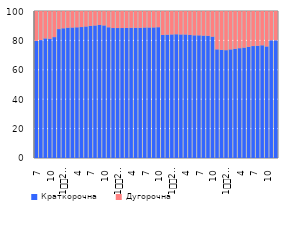
| Category | Краткорочна | Дугорочна |
|---|---|---|
| 7 | 79.672 | 20.328 |
| 8 | 80.226 | 19.774 |
| 9 | 81.351 | 18.649 |
| 10 | 81.133 | 18.867 |
| 11 | 82.237 | 17.763 |
| 12 | 87.688 | 12.312 |
| 1
2009. | 88.25 | 11.75 |
| 2 | 88.657 | 11.343 |
| 3 | 88.75 | 11.25 |
| 4 | 88.905 | 11.095 |
| 5 | 89.056 | 10.944 |
| 6 | 89.474 | 10.526 |
| 7 | 89.851 | 10.149 |
| 8 | 90.154 | 9.846 |
| 9 | 90.479 | 9.521 |
| 10 | 90.184 | 9.816 |
| 11 | 88.904 | 11.096 |
| 12 | 88.415 | 11.585 |
| 1
2010. | 88.393 | 11.607 |
| 2 | 88.418 | 11.582 |
| 3 | 88.494 | 11.506 |
| 4 | 88.597 | 11.403 |
| 5 | 88.578 | 11.422 |
| 6 | 88.59 | 11.41 |
| 7 | 88.749 | 11.251 |
| 8 | 88.784 | 11.216 |
| 9 | 88.831 | 11.169 |
| 10 | 88.984 | 11.016 |
| 11 | 83.713 | 16.287 |
| 12 | 83.915 | 16.085 |
| 1
2011. | 84.057 | 15.943 |
| 2 | 84.188 | 15.812 |
| 3 | 84.041 | 15.959 |
| 4 | 84.036 | 15.964 |
| 5 | 83.694 | 16.306 |
| 6 | 83.457 | 16.543 |
| 7 | 83.437 | 16.563 |
| 8 | 83.254 | 16.746 |
| 9 | 83.127 | 16.873 |
| 10 | 82.566 | 17.434 |
| 11 | 73.914 | 26.086 |
| 12 | 73.596 | 26.404 |
| 1
2012. | 73.361 | 26.639 |
| 2 | 73.876 | 26.124 |
| 3 | 74.282 | 25.718 |
| 4 | 74.705 | 25.295 |
| 5 | 75.102 | 24.898 |
| 6 | 75.595 | 24.405 |
| 7 | 76.154 | 23.846 |
| 8 | 76.355 | 23.645 |
| 9 | 76.684 | 23.316 |
| 10 | 75.887 | 24.113 |
| 11 | 80.09 | 19.91 |
| 12 | 80.09 | 19.91 |